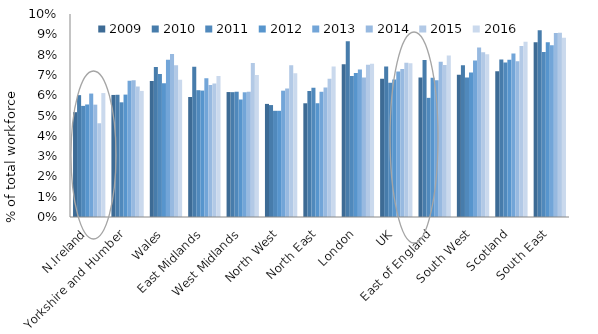
| Category | 2009 | 2010 | 2011 | 2012 | 2013 | 2014 | 2015 | 2016 |
|---|---|---|---|---|---|---|---|---|
| N.Ireland | 0.052 | 0.06 | 0.055 | 0.055 | 0.061 | 0.055 | 0.046 | 0.061 |
| Yorkshire and Humber | 0.06 | 0.06 | 0.056 | 0.06 | 0.067 | 0.067 | 0.064 | 0.062 |
| Wales | 0.067 | 0.074 | 0.07 | 0.066 | 0.077 | 0.08 | 0.075 | 0.068 |
| East Midlands | 0.059 | 0.074 | 0.062 | 0.062 | 0.068 | 0.065 | 0.066 | 0.069 |
| West Midlands | 0.062 | 0.061 | 0.062 | 0.058 | 0.061 | 0.062 | 0.076 | 0.07 |
| North West | 0.056 | 0.055 | 0.052 | 0.052 | 0.062 | 0.063 | 0.075 | 0.071 |
| North East | 0.056 | 0.062 | 0.064 | 0.056 | 0.062 | 0.064 | 0.068 | 0.074 |
| London | 0.075 | 0.087 | 0.069 | 0.071 | 0.073 | 0.069 | 0.075 | 0.075 |
| UK | 0.068 | 0.074 | 0.066 | 0.068 | 0.072 | 0.073 | 0.076 | 0.076 |
| East of England | 0.069 | 0.077 | 0.059 | 0.069 | 0.067 | 0.077 | 0.075 | 0.08 |
| South West | 0.07 | 0.075 | 0.069 | 0.071 | 0.077 | 0.083 | 0.081 | 0.08 |
| Scotland | 0.072 | 0.078 | 0.076 | 0.078 | 0.08 | 0.077 | 0.084 | 0.086 |
| South East | 0.086 | 0.092 | 0.081 | 0.086 | 0.085 | 0.091 | 0.091 | 0.088 |